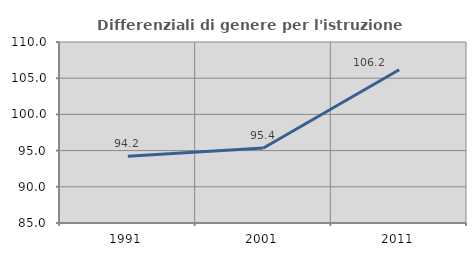
| Category | Differenziali di genere per l'istruzione superiore |
|---|---|
| 1991.0 | 94.214 |
| 2001.0 | 95.353 |
| 2011.0 | 106.174 |